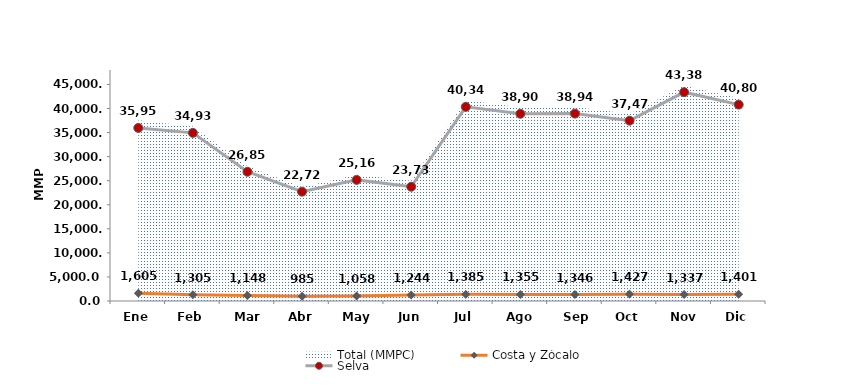
| Category | Costa y Zócalo | Selva |
|---|---|---|
| 43101.0 | 1605.456 | 35957.885 |
| 43132.0 | 1305.326 | 34938.053 |
| 43160.0 | 1148.441 | 26854.171 |
| 43191.0 | 985.46 | 22719.904 |
| 43221.0 | 1058.367 | 25165.004 |
| 43252.0 | 1244.49 | 23738.745 |
| 43282.0 | 1384.875 | 40344.272 |
| 43313.0 | 1354.635 | 38903.675 |
| 43344.0 | 1346.196 | 38943.091 |
| 43374.0 | 1427.011 | 37472.668 |
| 43405.0 | 1337.102 | 43385.539 |
| 43435.0 | 1401.013 | 40805.967 |